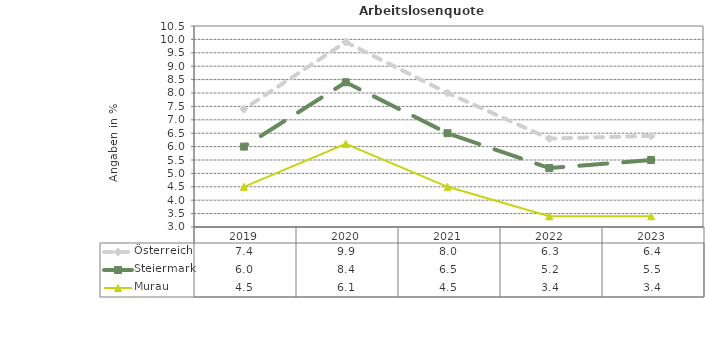
| Category | Österreich | Steiermark | Murau |
|---|---|---|---|
| 2023.0 | 6.4 | 5.5 | 3.4 |
| 2022.0 | 6.3 | 5.2 | 3.4 |
| 2021.0 | 8 | 6.5 | 4.5 |
| 2020.0 | 9.9 | 8.4 | 6.1 |
| 2019.0 | 7.4 | 6 | 4.5 |